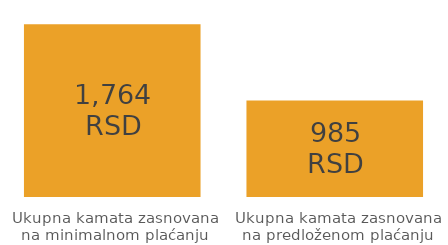
| Category | Series 0 |
|---|---|
| Ukupna kamata zasnovana na minimalnom plaćanju | 1763.952 |
| Ukupna kamata zasnovana na predloženom plaćanju | 984.811 |